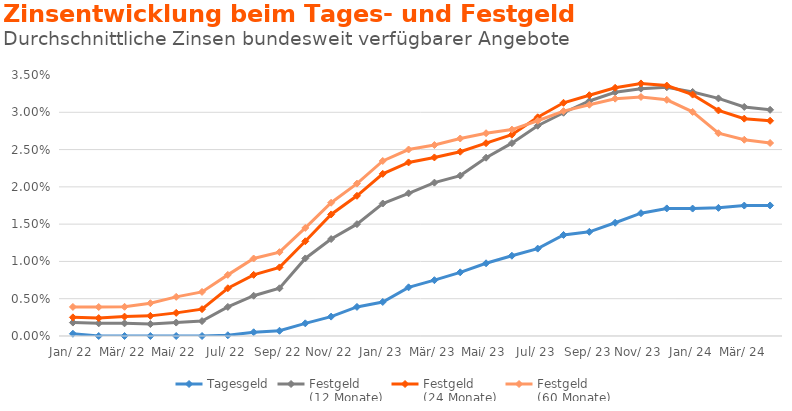
| Category | Tagesgeld | Festgeld 
(12 Monate) | Festgeld 
(24 Monate) | Festgeld 
(60 Monate) |
|---|---|---|---|---|
| Jan. 22 | 0 | 0.002 | 0.002 | 0.004 |
| Feb. 22 | 0 | 0.002 | 0.002 | 0.004 |
| Mrz. 22 | 0 | 0.002 | 0.003 | 0.004 |
| Apr. 22 | 0 | 0.002 | 0.003 | 0.004 |
| Mai. 22 | 0 | 0.002 | 0.003 | 0.005 |
| Jun. 22 | 0 | 0.002 | 0.004 | 0.006 |
| Jul. 22 | 0 | 0.004 | 0.006 | 0.008 |
| Aug. 22 | 0 | 0.005 | 0.008 | 0.01 |
| Sep. 22 | 0.001 | 0.006 | 0.009 | 0.011 |
| Okt. 22 | 0.002 | 0.01 | 0.013 | 0.014 |
| Nov. 22 | 0.003 | 0.013 | 0.016 | 0.018 |
| Dez. 22 | 0.004 | 0.015 | 0.019 | 0.02 |
| Jan. 23 | 0.005 | 0.018 | 0.022 | 0.023 |
| Feb. 23 | 0.007 | 0.019 | 0.023 | 0.025 |
| Mrz. 23 | 0.007 | 0.021 | 0.024 | 0.026 |
| Apr. 23 | 0.009 | 0.022 | 0.025 | 0.026 |
| Mai. 23 | 0.01 | 0.024 | 0.026 | 0.027 |
| Jun. 23 | 0.011 | 0.026 | 0.027 | 0.028 |
| Jul. 23 | 0.012 | 0.028 | 0.029 | 0.029 |
| Aug. 23 | 0.014 | 0.03 | 0.031 | 0.03 |
| Sep. 23 | 0.014 | 0.032 | 0.032 | 0.031 |
| Okt. 23 | 0.015 | 0.033 | 0.033 | 0.032 |
| Nov. 23 | 0.016 | 0.033 | 0.034 | 0.032 |
| Dez. 23 | 0.017 | 0.033 | 0.034 | 0.032 |
| Jan. 24 | 0.017 | 0.033 | 0.032 | 0.03 |
| Feb. 24 | 0.017 | 0.032 | 0.03 | 0.027 |
| Mrz. 24 | 0.017 | 0.031 | 0.029 | 0.026 |
| Akt. | 0.018 | 0.03 | 0.029 | 0.026 |